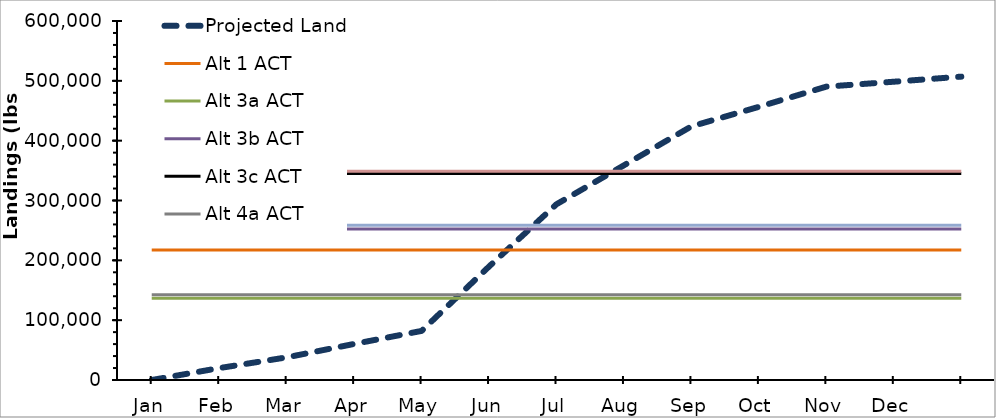
| Category | Projected Landings | Alt 1 ACT | Alt 3a ACT | Alt 3b ACT | Alt 3c ACT | Alt 4a ACT | Alt 4b ACT | Alt 4c ACT |
|---|---|---|---|---|---|---|---|---|
| Jan | 0 | 217100 | 136500 | 252200 | 345100 | 142400 | 258700 | 348700 |
| Feb | 19870.949 | 217100 | 136500 | 252200 | 345100 | 142400 | 258700 | 348700 |
| Mar | 37818.903 | 217100 | 136500 | 252200 | 345100 | 142400 | 258700 | 348700 |
| Apr | 60286.705 | 217100 | 136500 | 252200 | 345100 | 142400 | 258700 | 348700 |
| May | 82029.739 | 217100 | 136500 | 252200 | 345100 | 142400 | 258700 | 348700 |
| Jun | 189626.2 | 217100 | 136500 | 252200 | 345100 | 142400 | 258700 | 348700 |
| Jul | 293751.807 | 217100 | 136500 | 252200 | 345100 | 142400 | 258700 | 348700 |
| Aug | 358827.529 | 217100 | 136500 | 252200 | 345100 | 142400 | 258700 | 348700 |
| Sep | 423903.251 | 217100 | 136500 | 252200 | 345100 | 142400 | 258700 | 348700 |
| Oct | 456561.559 | 217100 | 136500 | 252200 | 345100 | 142400 | 258700 | 348700 |
| Nov | 490308.476 | 217100 | 136500 | 252200 | 345100 | 142400 | 258700 | 348700 |
| Dec | 498519.643 | 217100 | 136500 | 252200 | 345100 | 142400 | 258700 | 348700 |